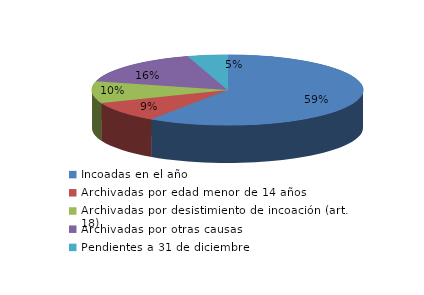
| Category | Series 0 |
|---|---|
| Incoadas en el año | 176 |
| Archivadas por edad menor de 14 años | 28 |
| Archivadas por desistimiento de incoación (art. 18) | 30 |
| Archivadas por otras causas | 48 |
| Pendientes a 31 de diciembre | 14 |